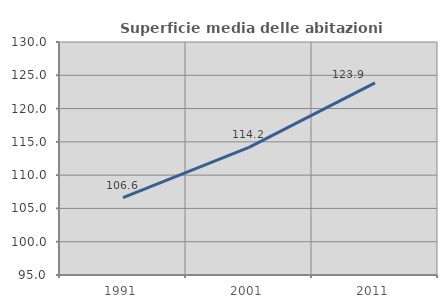
| Category | Superficie media delle abitazioni occupate |
|---|---|
| 1991.0 | 106.624 |
| 2001.0 | 114.169 |
| 2011.0 | 123.851 |